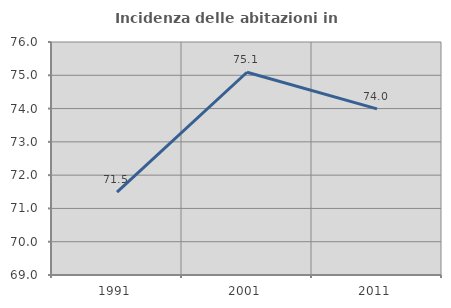
| Category | Incidenza delle abitazioni in proprietà  |
|---|---|
| 1991.0 | 71.489 |
| 2001.0 | 75.091 |
| 2011.0 | 73.991 |